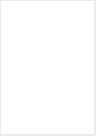
| Category | 0 | Series 6 | Series 9 | Series 10 | Series 11 | Series 12 | UK share |
|---|---|---|---|---|---|---|---|
| No changes   | 0 |  |  |  |  |  | 30.046 |
| Changes | 0 |  |  |  |  |  | 30.046 |